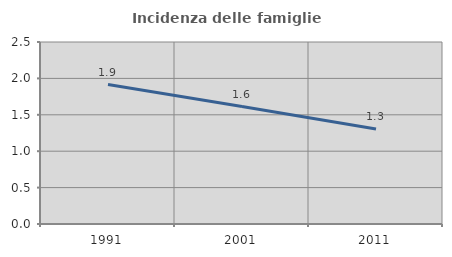
| Category | Incidenza delle famiglie numerose |
|---|---|
| 1991.0 | 1.916 |
| 2001.0 | 1.613 |
| 2011.0 | 1.305 |